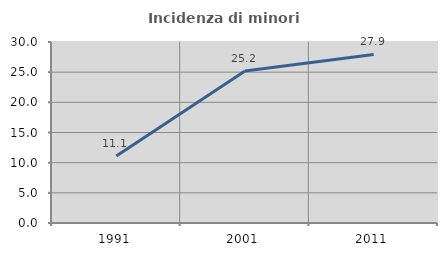
| Category | Incidenza di minori stranieri |
|---|---|
| 1991.0 | 11.111 |
| 2001.0 | 25.185 |
| 2011.0 | 27.933 |